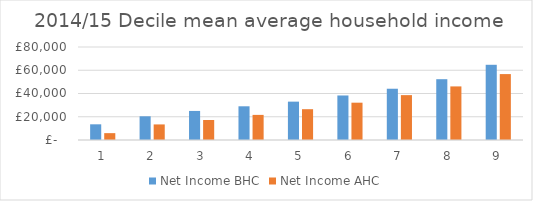
| Category | Net Income BHC | Net Income AHC |
|---|---|---|
| 0 | 13500 | 5900 |
| 1 | 20400 | 13400 |
| 2 | 25000 | 17200 |
| 3 | 29000 | 21600 |
| 4 | 33000 | 26500 |
| 5 | 38300 | 32100 |
| 6 | 44100 | 38600 |
| 7 | 52300 | 46100 |
| 8 | 64700 | 56700 |